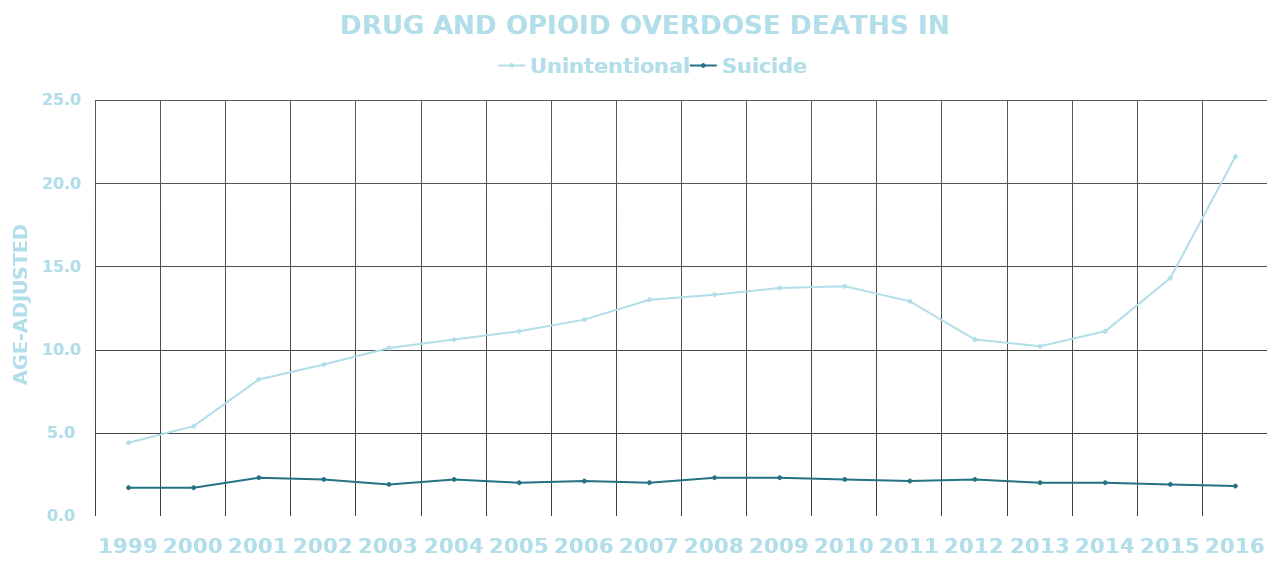
| Category | Unintentional | Suicide |
|---|---|---|
| 1999.0 | 4.4 | 1.7 |
| 2000.0 | 5.4 | 1.7 |
| 2001.0 | 8.2 | 2.3 |
| 2002.0 | 9.1 | 2.2 |
| 2003.0 | 10.1 | 1.9 |
| 2004.0 | 10.6 | 2.2 |
| 2005.0 | 11.1 | 2 |
| 2006.0 | 11.8 | 2.1 |
| 2007.0 | 13 | 2 |
| 2008.0 | 13.3 | 2.3 |
| 2009.0 | 13.7 | 2.3 |
| 2010.0 | 13.8 | 2.2 |
| 2011.0 | 12.9 | 2.1 |
| 2012.0 | 10.6 | 2.2 |
| 2013.0 | 10.2 | 2 |
| 2014.0 | 11.1 | 2 |
| 2015.0 | 14.3 | 1.9 |
| 2016.0 | 21.6 | 1.8 |